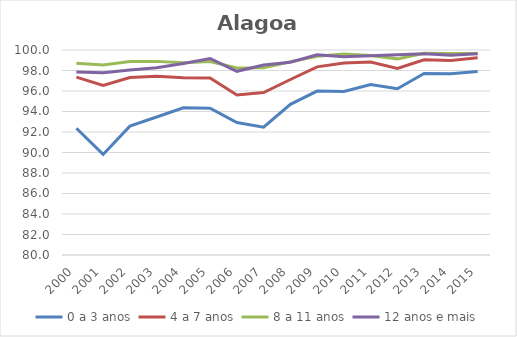
| Category | 0 a 3 anos | 4 a 7 anos | 8 a 11 anos | 12 anos e mais |
|---|---|---|---|---|
| 2000.0 | 92.37 | 97.354 | 98.698 | 97.849 |
| 2001.0 | 89.812 | 96.542 | 98.546 | 97.78 |
| 2002.0 | 92.569 | 97.306 | 98.876 | 98.046 |
| 2003.0 | 93.462 | 97.447 | 98.89 | 98.269 |
| 2004.0 | 94.357 | 97.289 | 98.746 | 98.689 |
| 2005.0 | 94.322 | 97.26 | 98.87 | 99.174 |
| 2006.0 | 92.918 | 95.609 | 98.251 | 97.92 |
| 2007.0 | 92.467 | 95.844 | 98.262 | 98.533 |
| 2008.0 | 94.7 | 97.12 | 98.853 | 98.805 |
| 2009.0 | 95.988 | 98.356 | 99.398 | 99.531 |
| 2010.0 | 95.946 | 98.736 | 99.601 | 99.339 |
| 2011.0 | 96.621 | 98.826 | 99.474 | 99.445 |
| 2012.0 | 96.225 | 98.192 | 99.136 | 99.535 |
| 2013.0 | 97.707 | 99.051 | 99.684 | 99.631 |
| 2014.0 | 97.694 | 98.987 | 99.652 | 99.483 |
| 2015.0 | 97.91 | 99.243 | 99.664 | 99.632 |